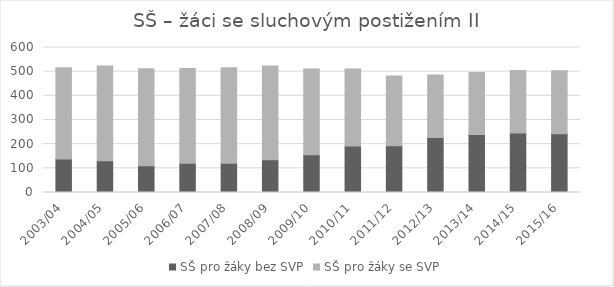
| Category | SŠ pro žáky bez SVP | SŠ pro žáky se SVP |
|---|---|---|
| 2003/04 | 139 | 377 |
| 2004/05 | 131 | 392 |
| 2005/06 | 111 | 401 |
| 2006/07 | 121 | 392 |
| 2007/08 | 121 | 395 |
| 2008/09 | 136 | 387 |
| 2009/10 | 156 | 355 |
| 2010/11 | 192 | 319 |
| 2011/12 | 193 | 289 |
| 2012/13 | 228 | 258 |
| 2013/14 | 240 | 257 |
| 2014/15 | 246 | 259 |
| 2015/16 | 243 | 261 |